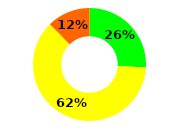
| Category | Series 0 |
|---|---|
| = | 0.258 |
| > | 0.618 |
| < | 0.124 |